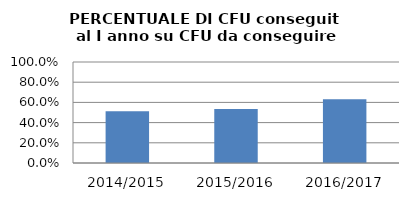
| Category | 2014/2015 2015/2016 2016/2017 |
|---|---|
| 2014/2015 | 0.514 |
| 2015/2016 | 0.535 |
| 2016/2017 | 0.631 |